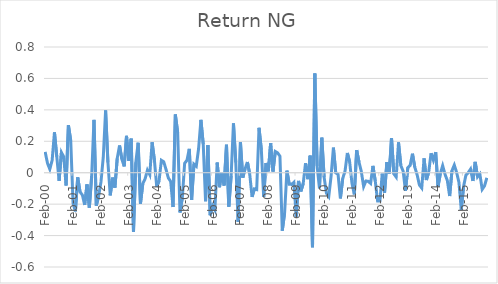
| Category | Series 0 |
|---|---|
| 2000-02-01 | 0.133 |
| 2000-03-01 | 0.061 |
| 2000-04-01 | 0.022 |
| 2000-05-01 | 0.079 |
| 2000-06-01 | 0.257 |
| 2000-07-01 | 0.102 |
| 2000-08-01 | -0.052 |
| 2000-09-01 | 0.129 |
| 2000-10-01 | 0.101 |
| 2000-11-01 | -0.081 |
| 2000-12-01 | 0.303 |
| 2001-01-01 | 0.205 |
| 2001-02-01 | -0.194 |
| 2001-03-01 | -0.246 |
| 2001-04-01 | -0.03 |
| 2001-05-01 | -0.122 |
| 2001-06-01 | -0.141 |
| 2001-07-01 | -0.205 |
| 2001-08-01 | -0.075 |
| 2001-09-01 | -0.222 |
| 2001-10-01 | -0.026 |
| 2001-11-01 | 0.336 |
| 2001-12-01 | -0.21 |
| 2002-01-01 | -0.15 |
| 2002-02-01 | -0.059 |
| 2002-03-01 | 0.098 |
| 2002-04-01 | 0.396 |
| 2002-05-01 | 0.066 |
| 2002-06-01 | -0.144 |
| 2002-07-01 | -0.031 |
| 2002-08-01 | -0.095 |
| 2002-09-01 | 0.092 |
| 2002-10-01 | 0.173 |
| 2002-11-01 | 0.086 |
| 2002-12-01 | 0.04 |
| 2003-01-01 | 0.235 |
| 2003-02-01 | 0.076 |
| 2003-03-01 | 0.217 |
| 2003-04-01 | -0.376 |
| 2003-05-01 | 0.066 |
| 2003-06-01 | 0.191 |
| 2003-07-01 | -0.196 |
| 2003-08-01 | -0.07 |
| 2003-09-01 | -0.038 |
| 2003-10-01 | 0.016 |
| 2003-11-01 | -0.013 |
| 2003-12-01 | 0.194 |
| 2004-01-01 | 0.079 |
| 2004-02-01 | -0.09 |
| 2004-03-01 | -0.051 |
| 2004-04-01 | 0.079 |
| 2004-05-01 | 0.069 |
| 2004-06-01 | 0.021 |
| 2004-07-01 | -0.034 |
| 2004-08-01 | -0.056 |
| 2004-09-01 | -0.218 |
| 2004-10-01 | 0.371 |
| 2004-11-01 | 0.256 |
| 2004-12-01 | -0.253 |
| 2005-01-01 | -0.16 |
| 2005-02-01 | 0.06 |
| 2005-03-01 | 0.079 |
| 2005-04-01 | 0.152 |
| 2005-05-01 | -0.173 |
| 2005-06-01 | 0.055 |
| 2005-07-01 | 0.041 |
| 2005-08-01 | 0.152 |
| 2005-09-01 | 0.336 |
| 2005-10-01 | 0.181 |
| 2005-11-01 | -0.182 |
| 2005-12-01 | 0.175 |
| 2006-01-01 | -0.271 |
| 2006-02-01 | -0.21 |
| 2006-03-01 | -0.238 |
| 2006-04-01 | 0.065 |
| 2006-05-01 | -0.092 |
| 2006-06-01 | 0.003 |
| 2006-07-01 | -0.082 |
| 2006-08-01 | 0.178 |
| 2006-09-01 | -0.216 |
| 2006-10-01 | -0.02 |
| 2006-11-01 | 0.314 |
| 2006-12-01 | 0.066 |
| 2007-01-01 | -0.312 |
| 2007-02-01 | 0.193 |
| 2007-03-01 | -0.032 |
| 2007-04-01 | 0.025 |
| 2007-05-01 | 0.068 |
| 2007-06-01 | -0.009 |
| 2007-07-01 | -0.154 |
| 2007-08-01 | -0.103 |
| 2007-09-01 | -0.108 |
| 2007-10-01 | 0.286 |
| 2007-11-01 | 0.146 |
| 2007-12-01 | -0.154 |
| 2008-01-01 | 0.062 |
| 2008-02-01 | 0.009 |
| 2008-03-01 | 0.189 |
| 2008-04-01 | 0.008 |
| 2008-05-01 | 0.135 |
| 2008-06-01 | 0.126 |
| 2008-07-01 | 0.105 |
| 2008-08-01 | -0.369 |
| 2008-09-01 | -0.257 |
| 2008-10-01 | 0.013 |
| 2008-11-01 | -0.073 |
| 2008-12-01 | -0.075 |
| 2009-01-01 | -0.061 |
| 2009-02-01 | -0.28 |
| 2009-03-01 | -0.053 |
| 2009-04-01 | -0.119 |
| 2009-05-01 | -0.069 |
| 2009-06-01 | 0.06 |
| 2009-07-01 | -0.041 |
| 2009-08-01 | 0.109 |
| 2009-09-01 | -0.475 |
| 2009-10-01 | 0.632 |
| 2009-11-01 | 0.042 |
| 2009-12-01 | -0.099 |
| 2010-01-01 | 0.223 |
| 2010-02-01 | -0.028 |
| 2010-03-01 | -0.13 |
| 2010-04-01 | -0.152 |
| 2010-05-01 | -0.021 |
| 2010-06-01 | 0.159 |
| 2010-07-01 | -0.001 |
| 2010-08-01 | -0.01 |
| 2010-09-01 | -0.164 |
| 2010-10-01 | -0.037 |
| 2010-11-01 | 0.01 |
| 2010-12-01 | 0.126 |
| 2011-01-01 | 0.067 |
| 2011-02-01 | -0.07 |
| 2011-03-01 | -0.138 |
| 2011-04-01 | 0.144 |
| 2011-05-01 | 0.068 |
| 2011-06-01 | 0.008 |
| 2011-07-01 | -0.088 |
| 2011-08-01 | -0.053 |
| 2011-09-01 | -0.055 |
| 2011-10-01 | -0.068 |
| 2011-11-01 | 0.044 |
| 2011-12-01 | -0.053 |
| 2012-01-01 | -0.18 |
| 2012-02-01 | -0.18 |
| 2012-03-01 | -0.006 |
| 2012-04-01 | -0.127 |
| 2012-05-01 | 0.068 |
| 2012-06-01 | -0.006 |
| 2012-07-01 | 0.22 |
| 2012-08-01 | -0.008 |
| 2012-09-01 | -0.027 |
| 2012-10-01 | 0.193 |
| 2012-11-01 | 0.046 |
| 2012-12-01 | 0.01 |
| 2013-01-01 | -0.116 |
| 2013-02-01 | 0.032 |
| 2013-03-01 | 0.046 |
| 2013-04-01 | 0.121 |
| 2013-05-01 | 0.036 |
| 2013-06-01 | -0.012 |
| 2013-07-01 | -0.078 |
| 2013-08-01 | -0.098 |
| 2013-09-01 | 0.091 |
| 2013-10-01 | -0.047 |
| 2013-11-01 | 0.004 |
| 2013-12-01 | 0.124 |
| 2014-01-01 | 0.079 |
| 2014-02-01 | 0.131 |
| 2014-03-01 | -0.088 |
| 2014-04-01 | -0.005 |
| 2014-05-01 | 0.045 |
| 2014-06-01 | -0.01 |
| 2014-07-01 | -0.049 |
| 2014-08-01 | -0.148 |
| 2014-09-01 | 0.013 |
| 2014-10-01 | 0.049 |
| 2014-11-01 | 0.002 |
| 2014-12-01 | -0.061 |
| 2015-01-01 | -0.237 |
| 2015-02-01 | -0.087 |
| 2015-03-01 | -0.015 |
| 2015-04-01 | 0 |
| 2015-05-01 | 0.023 |
| 2015-06-01 | -0.053 |
| 2015-07-01 | 0.069 |
| 2015-08-01 | -0.027 |
| 2015-09-01 | -0.008 |
| 2015-10-01 | -0.106 |
| 2015-11-01 | -0.084 |
| 2015-12-01 | -0.032 |